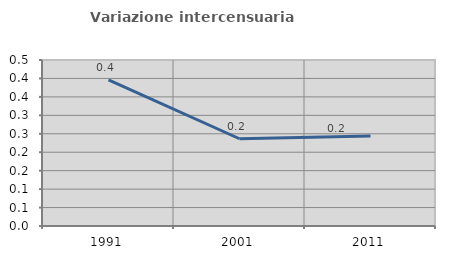
| Category | Variazione intercensuaria annua |
|---|---|
| 1991.0 | 0.396 |
| 2001.0 | 0.237 |
| 2011.0 | 0.244 |